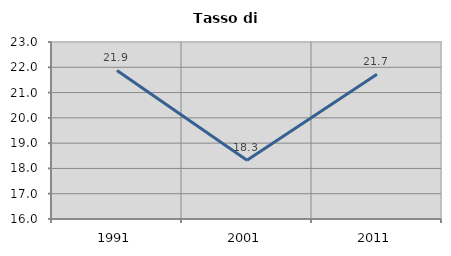
| Category | Tasso di disoccupazione   |
|---|---|
| 1991.0 | 21.876 |
| 2001.0 | 18.323 |
| 2011.0 | 21.725 |